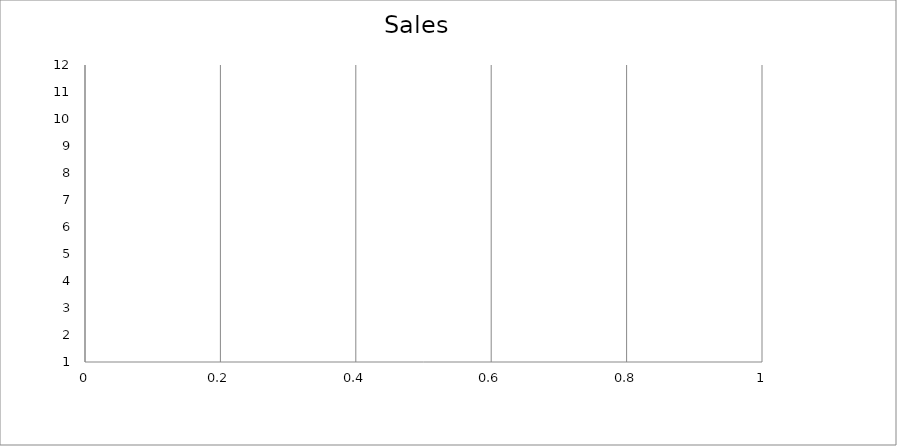
| Category | Actual |
|---|---|
| 0 | 2820 |
| 1 | 1380 |
| 2 | 3390 |
| 3 | 1540 |
| 4 | 2100 |
| 5 | 720 |
| 6 | 3480 |
| 7 | 3000 |
| 8 | 1560 |
| 9 | 3120 |
| 10 | 2440 |
| 11 | 3420 |